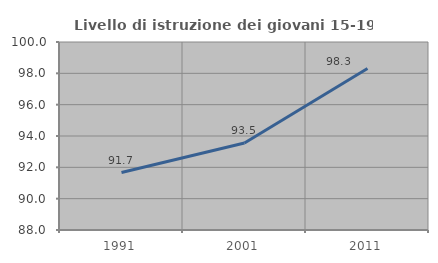
| Category | Livello di istruzione dei giovani 15-19 anni |
|---|---|
| 1991.0 | 91.667 |
| 2001.0 | 93.548 |
| 2011.0 | 98.305 |